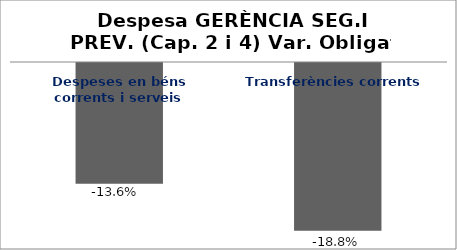
| Category | Series 0 |
|---|---|
| Despeses en béns corrents i serveis | -0.136 |
| Transferències corrents | -0.188 |